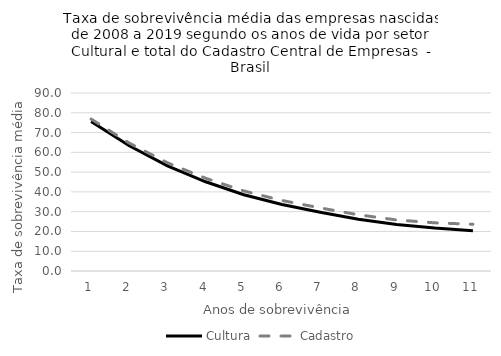
| Category | Cultura | Cadastro |
|---|---|---|
| 1.0 | 75.574 | 76.835 |
| 2.0 | 63.295 | 64.666 |
| 3.0 | 53.123 | 54.699 |
| 4.0 | 45.106 | 46.896 |
| 5.0 | 38.545 | 40.48 |
| 6.0 | 33.605 | 35.651 |
| 7.0 | 29.739 | 31.91 |
| 8.0 | 26.181 | 28.438 |
| 9.0 | 23.509 | 25.818 |
| 10.0 | 21.689 | 24.359 |
| 11.0 | 20.376 | 23.64 |